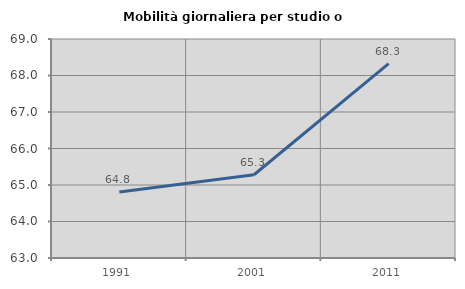
| Category | Mobilità giornaliera per studio o lavoro |
|---|---|
| 1991.0 | 64.808 |
| 2001.0 | 65.281 |
| 2011.0 | 68.324 |